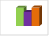
| Category | област Силистра |
|---|---|
| летен сезон 2019  | 18791 |
| летен сезон 2021  | 14440 |
| летен сезон 2022 г.  | 18902 |